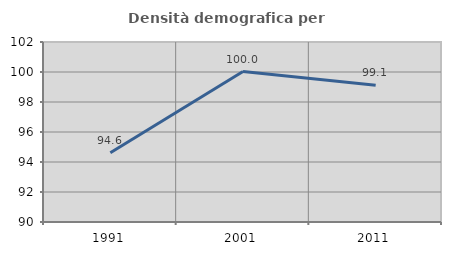
| Category | Densità demografica |
|---|---|
| 1991.0 | 94.618 |
| 2001.0 | 100.028 |
| 2011.0 | 99.11 |